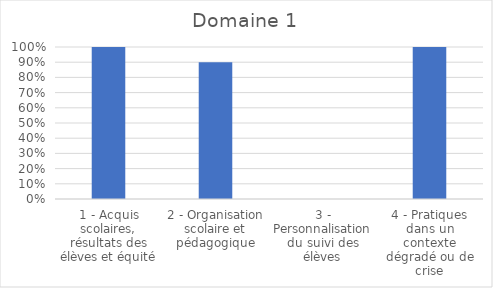
| Category | Series 0 |
|---|---|
| 1 - Acquis scolaires, résultats des élèves et équité | 1 |
| 2 - Organisation scolaire et pédagogique | 0.9 |
| 3 - Personnalisation du suivi des élèves | 0 |
| 4 - Pratiques dans un contexte dégradé ou de crise | 1 |